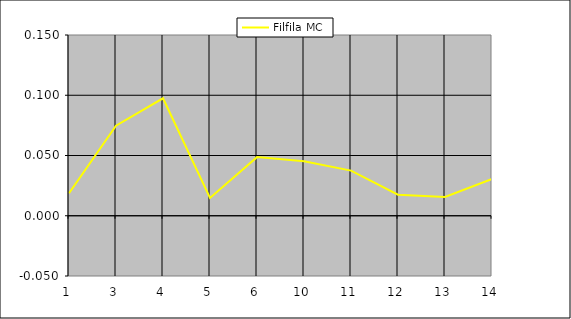
| Category | Filfila MC |
|---|---|
| 1.0 | 0.019 |
| 3.0 | 0.075 |
| 4.0 | 0.097 |
| 5.0 | 0.015 |
| 6.0 | 0.049 |
| 10.0 | 0.045 |
| 11.0 | 0.037 |
| 12.0 | 0.018 |
| 13.0 | 0.016 |
| 14.0 | 0.031 |